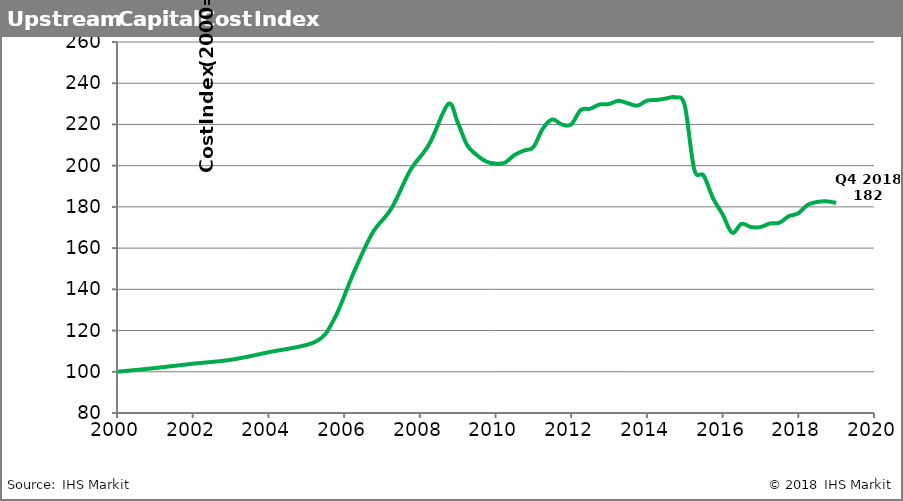
| Category | UCCI |
|---|---|
| 2000.0 | 100 |
| 2001.0 | 101.8 |
| 2002.0 | 103.9 |
| 2003.0 | 105.8 |
| 2004.0 | 109.462 |
| 2005.25 | 114.642 |
| 2005.75 | 126.023 |
| 2006.25 | 147.973 |
| 2006.75 | 167.369 |
| 2007.25 | 179.244 |
| 2007.75 | 197.8 |
| 2008.25 | 210.45 |
| 2008.75 | 229.896 |
| 2009.0 | 221 |
| 2009.25 | 210 |
| 2009.5 | 205.236 |
| 2009.75 | 202.036 |
| 2010.0 | 201 |
| 2010.25 | 201.483 |
| 2010.5 | 205.14 |
| 2010.75 | 207.332 |
| 2011.0 | 209 |
| 2011.25 | 218 |
| 2011.5 | 222.425 |
| 2011.75 | 220 |
| 2012.0 | 220 |
| 2012.25 | 227 |
| 2012.5 | 227.609 |
| 2012.75 | 229.683 |
| 2013.0 | 229.912 |
| 2013.25 | 231.471 |
| 2013.5 | 230.245 |
| 2013.75 | 229.132 |
| 2014.0 | 231.54 |
| 2014.25 | 231.871 |
| 2014.5 | 232.573 |
| 2014.75 | 233.169 |
| 2015.0 | 229.139 |
| 2015.25 | 198.243 |
| 2015.5 | 195.148 |
| 2015.75 | 184.075 |
| 2016.0 | 176.374 |
| 2016.25 | 167.468 |
| 2016.5 | 171.777 |
| 2016.75 | 170.234 |
| 2017.0 | 170.229 |
| 2017.25 | 171.948 |
| 2017.5 | 172.316 |
| 2017.75 | 175.477 |
| 2018.0 | 176.905 |
| 2018.25 | 181.013 |
| 2018.5 | 182.394 |
| 2018.75 | 182.686 |
| 2019.0 | 181.939 |